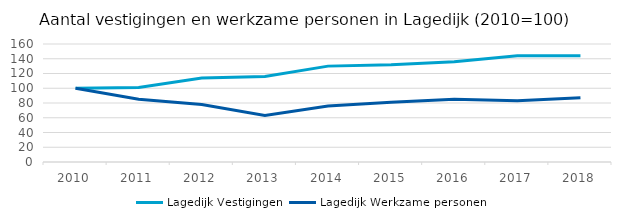
| Category | Lagedijk |
|---|---|
| 2010.0 | 100 |
| 2011.0 | 85 |
| 2012.0 | 78 |
| 2013.0 | 63 |
| 2014.0 | 76 |
| 2015.0 | 81 |
| 2016.0 | 85 |
| 2017.0 | 83 |
| 2018.0 | 87 |